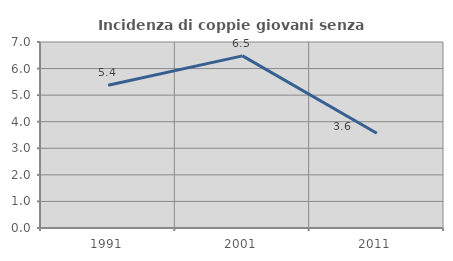
| Category | Incidenza di coppie giovani senza figli |
|---|---|
| 1991.0 | 5.371 |
| 2001.0 | 6.479 |
| 2011.0 | 3.567 |